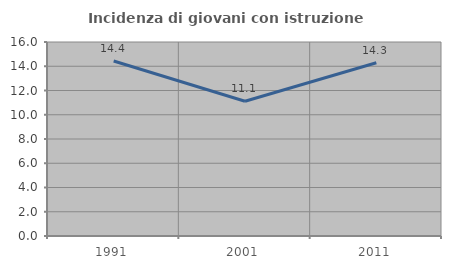
| Category | Incidenza di giovani con istruzione universitaria |
|---|---|
| 1991.0 | 14.433 |
| 2001.0 | 11.111 |
| 2011.0 | 14.286 |